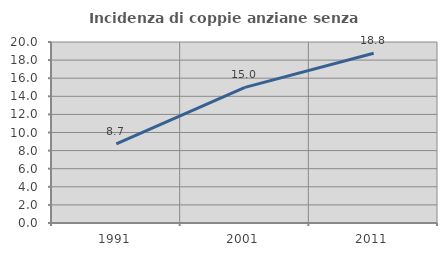
| Category | Incidenza di coppie anziane senza figli  |
|---|---|
| 1991.0 | 8.73 |
| 2001.0 | 14.983 |
| 2011.0 | 18.75 |